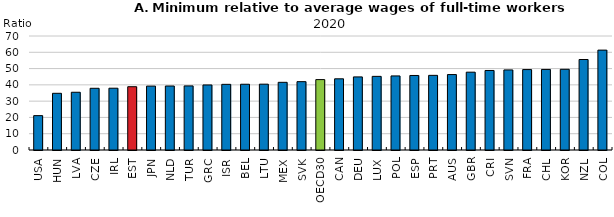
| Category | Series 0 |
|---|---|
| USA | 21.106 |
| HUN | 34.817 |
| LVA | 35.453 |
| CZE | 37.896 |
| IRL | 37.941 |
| EST | 38.862 |
| JPN | 39.234 |
| NLD | 39.291 |
| TUR | 39.356 |
| GRC | 39.938 |
| ISR | 40.322 |
| BEL | 40.382 |
| LTU | 40.429 |
| MEX | 41.555 |
| SVK | 41.96 |
| OECD30 | 43.228 |
| CAN | 43.714 |
| DEU | 44.88 |
| LUX | 45.209 |
| POL | 45.483 |
| ESP | 45.765 |
| PRT | 45.833 |
| AUS | 46.33 |
| GBR | 47.781 |
| CRI | 48.827 |
| SVN | 49.17 |
| FRA | 49.383 |
| CHL | 49.472 |
| KOR | 49.563 |
| NZL | 55.564 |
| COL | 61.329 |